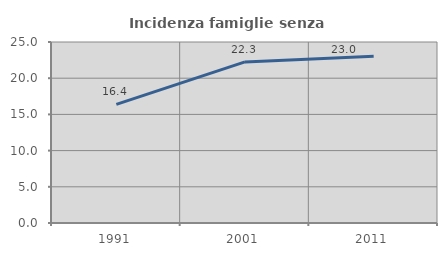
| Category | Incidenza famiglie senza nuclei |
|---|---|
| 1991.0 | 16.374 |
| 2001.0 | 22.252 |
| 2011.0 | 23.038 |